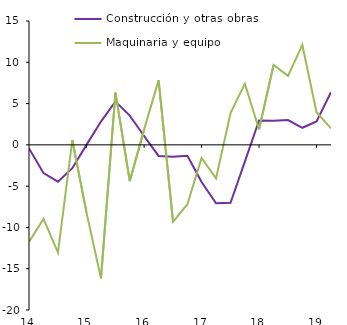
| Category | Construcción y otras obras | Maquinaria y equipo |
|---|---|---|
| 2014-03-01 | -0.427 | -11.749 |
| 2014-06-01 | -3.414 | -8.974 |
| 2014-09-01 | -4.463 | -13.048 |
| 2014-12-01 | -2.83 | 0.585 |
| 2015-03-01 | -0.002 | -8.175 |
| 2015-06-01 | 2.819 | -16.173 |
| 2015-09-01 | 5.258 | 6.321 |
| 2015-12-01 | 3.547 | -4.393 |
| 2016-03-01 | 1.068 | 1.845 |
| 2016-06-01 | -1.34 | 7.841 |
| 2016-09-01 | -1.442 | -9.321 |
| 2016-12-01 | -1.314 | -7.187 |
| 2017-03-01 | -4.498 | -1.587 |
| 2017-06-01 | -7.076 | -4.049 |
| 2017-09-01 | -7.017 | 3.841 |
| 2017-12-01 | -2.032 | 7.416 |
| 2018-03-01 | 2.962 | 1.863 |
| 2018-06-01 | 2.918 | 9.665 |
| 2018-09-01 | 3.002 | 8.354 |
| 2018-12-01 | 2.068 | 12.1 |
| 2019-03-01 | 2.836 | 3.947 |
| 2019-06-01 | 6.378 | 1.988 |